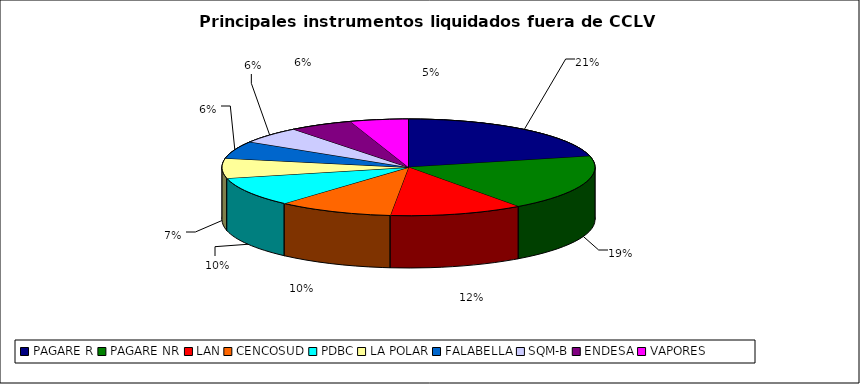
| Category | Series 0 |
|---|---|
| PAGARE R | 1431 |
| PAGARE NR | 1255 |
| LAN | 776 |
| CENCOSUD | 674 |
| PDBC | 657 |
| LA POLAR | 446 |
| FALABELLA | 390 |
| SQM-B | 376 |
| ENDESA | 370 |
| VAPORES | 339 |